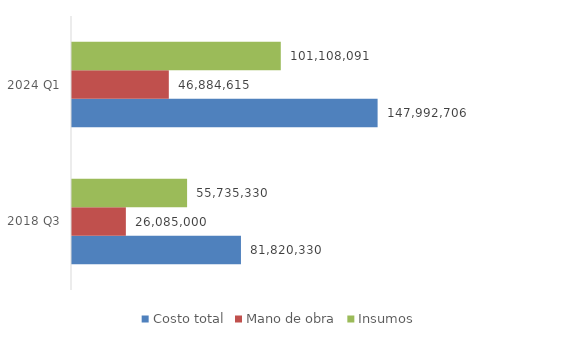
| Category | Costo total | Mano de obra | Insumos |
|---|---|---|---|
| 2018 Q3 | 81820330 | 26085000 | 55735330 |
| 2024 Q1 | 147992706.376 | 46884615 | 101108091.376 |